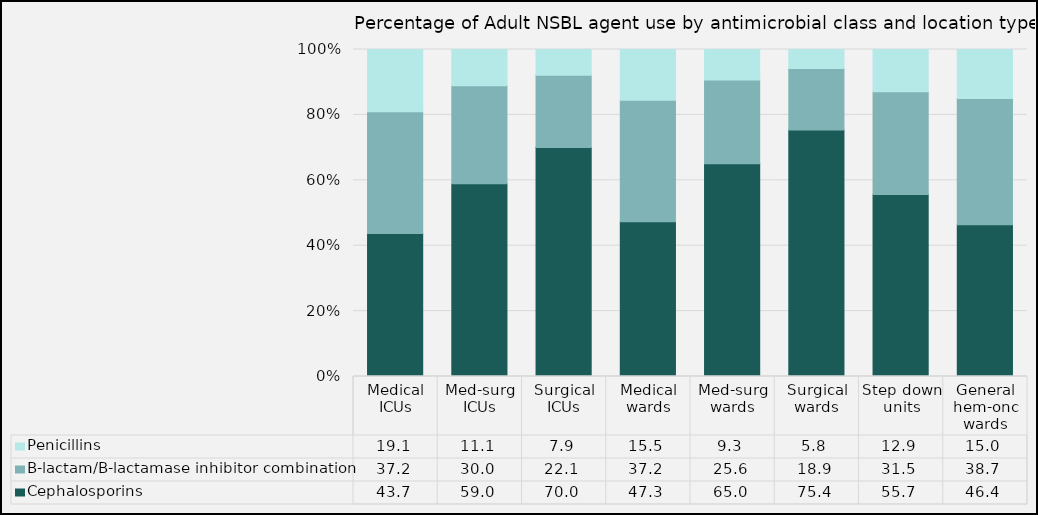
| Category | Cephalosporins | B-lactam/B-lactamase inhibitor combination | Penicillins |
|---|---|---|---|
| Medical ICUs | 43.72 | 37.22 | 19.06 |
| Med-surg ICUs | 58.96 | 29.95 | 11.1 |
| Surgical ICUs | 70.04 | 22.09 | 7.86 |
| Medical wards | 47.34 | 37.16 | 15.5 |
| Med-surg wards | 65.03 | 25.64 | 9.33 |
| Surgical wards | 75.36 | 18.85 | 5.8 |
| Step down units | 55.66 | 31.46 | 12.89 |
| General hem-onc wards | 46.37 | 38.68 | 14.95 |